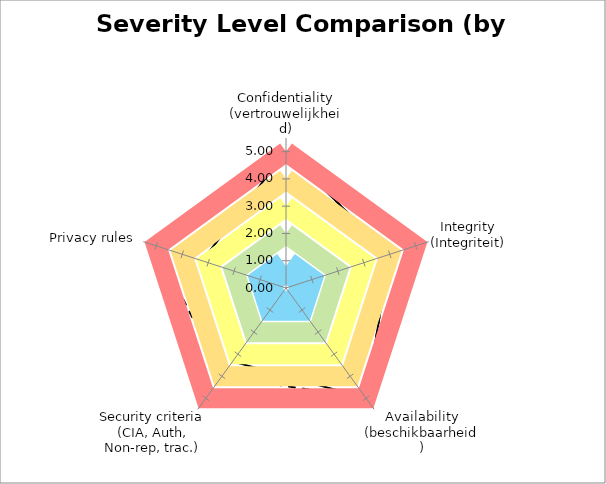
| Category | Average | Max | B | G | Y | O | R |
|---|---|---|---|---|---|---|---|
| Confidentiality (vertrouwelijkheid) | 5 | 5 | 0.8 | 2 | 3 | 4 | 5 |
| Integrity (Integriteit) | 4 | 4 | 0.8 | 2 | 3 | 4 | 5 |
| Availability (beschikbaarheid) | 5 | 5 | 0.8 | 2 | 3 | 4 | 5 |
| Security criteria (CIA, Auth, Non-rep, trac.) | 3.333 | 4 | 0.8 | 2 | 3 | 4 | 5 |
| Privacy rules  | 3.231 | 5 | 0.8 | 2 | 3 | 4 | 5 |